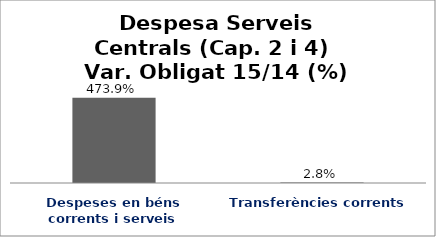
| Category | Series 0 |
|---|---|
| Despeses en béns corrents i serveis | 4.739 |
| Transferències corrents | 0.028 |